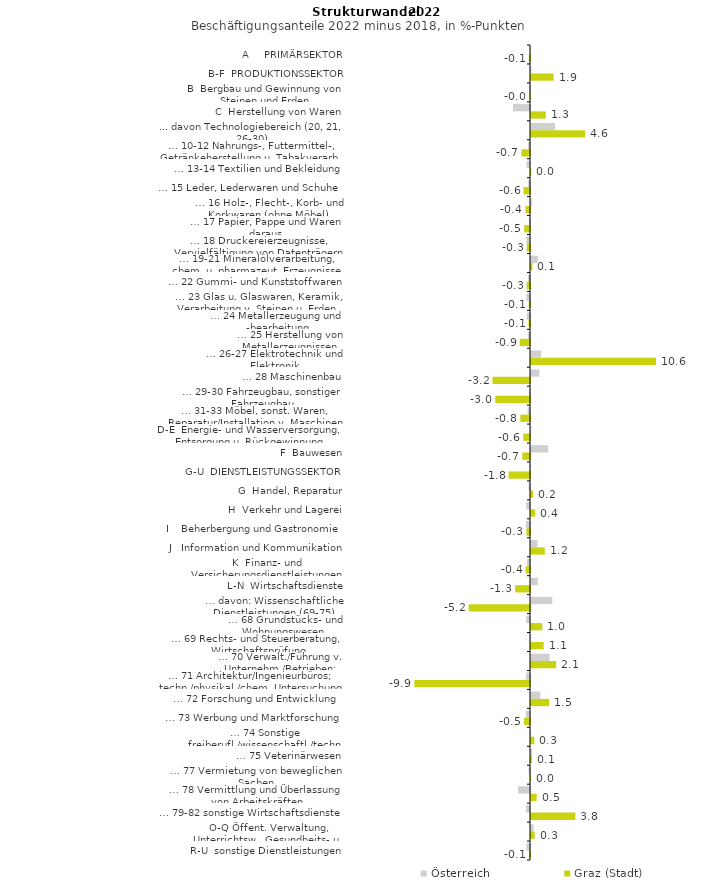
| Category | Österreich | Graz (Stadt) |
|---|---|---|
| A     PRIMÄRSEKTOR | 0.004 | -0.101 |
| B-F  PRODUKTIONSSEKTOR | 0.036 | 1.93 |
| B  Bergbau und Gewinnung von Steinen und Erden | -0.063 | -0.029 |
| C  Herstellung von Waren | -1.445 | 1.267 |
| ... davon Technologiebereich (20, 21, 26-30) | 2.047 | 4.618 |
| … 10-12 Nahrungs-, Futtermittel-, Getränkeherstellung u. Tabakverarb. | -0.163 | -0.736 |
| … 13-14 Textilien und Bekleidung | -0.292 | 0.036 |
| … 15 Leder, Lederwaren und Schuhe | -0.15 | -0.554 |
| … 16 Holz-, Flecht-, Korb- und Korkwaren (ohne Möbel)  | 0.068 | -0.388 |
| … 17 Papier, Pappe und Waren daraus  | -0.09 | -0.5 |
| … 18 Druckereierzeugnisse, Vervielfältigung von Datenträgern | -0.314 | -0.272 |
| … 19-21 Mineralölverarbeitung, chem. u. pharmazeut. Erzeugnisse | 0.584 | 0.123 |
| … 22 Gummi- und Kunststoffwaren | -0.168 | -0.284 |
| … 23 Glas u. Glaswaren, Keramik, Verarbeitung v. Steinen u. Erden  | -0.312 | -0.106 |
| … 24 Metallerzeugung und -bearbeitung | -0.276 | -0.122 |
| … 25 Herstellung von Metallerzeugnissen  | -0.185 | -0.871 |
| … 26-27 Elektrotechnik und Elektronik | 0.862 | 10.648 |
| … 28 Maschinenbau | 0.705 | -3.193 |
| … 29-30 Fahrzeugbau, sonstiger Fahrzeugbau | -0.066 | -2.963 |
| … 31-33 Möbel, sonst. Waren, Reparatur/Installation v. Maschinen | -0.204 | -0.825 |
| D-E  Energie- und Wasserversorgung, Entsorgung u. Rückgewinnung | 0.038 | -0.577 |
| F  Bauwesen | 1.469 | -0.658 |
| G-U  DIENSTLEISTUNGSSEKTOR | -0.04 | -1.829 |
| G  Handel, Reparatur | -0.115 | 0.18 |
| H  Verkehr und Lagerei | -0.33 | 0.357 |
| I    Beherbergung und Gastronomie | -0.34 | -0.307 |
| J   Information und Kommunikation | 0.551 | 1.174 |
| K  Finanz- und Versicherungsdienstleistungen | -0.255 | -0.374 |
| L-N  Wirtschaftsdienste | 0.586 | -1.264 |
| … davon: Wissenschaftliche Dienstleistungen (69-75) | 1.815 | -5.235 |
| … 68 Grundstücks- und Wohnungswesen  | -0.331 | 0.966 |
| … 69 Rechts- und Steuerberatung, Wirtschaftsprüfung | 0.008 | 1.074 |
| … 70 Verwalt./Führung v. Unternehm./Betrieben; Unternehmensberat. | 1.583 | 2.14 |
| … 71 Architektur/Ingenieurbüros; techn./physikal./chem. Untersuchung | -0.344 | -9.856 |
| … 72 Forschung und Entwicklung  | 0.797 | 1.537 |
| … 73 Werbung und Marktforschung | -0.361 | -0.503 |
| … 74 Sonstige freiberufl./wissenschaftl./techn. Tätigkeiten | 0.025 | 0.297 |
| … 75 Veterinärwesen | 0.108 | 0.081 |
| … 77 Vermietung von beweglichen Sachen  | -0.116 | 0.009 |
| … 78 Vermittlung und Überlassung von Arbeitskräften | -1.018 | 0.48 |
| … 79-82 sonstige Wirtschaftsdienste | -0.351 | 3.78 |
| O-Q Öffent. Verwaltung, Unterrichtsw., Gesundheits- u. Sozialwesen | 0.216 | 0.315 |
| R-U  sonstige Dienstleistungen | -0.314 | -0.079 |